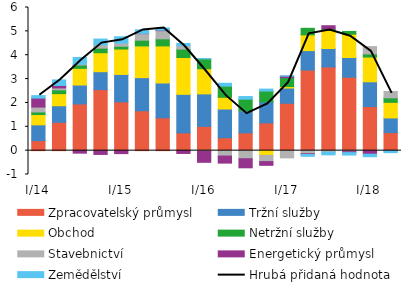
| Category | Zpracovatelský průmysl | Tržní služby | Obchod | Netržní služby  | Stavebnictví | Energetický průmysl | Zemědělství |
|---|---|---|---|---|---|---|---|
| I/14 | 0.421 | 0.66 | 0.432 | 0.109 | 0.205 | 0.374 | 0.105 |
| II | 1.187 | 0.694 | 0.508 | 0.16 | 0.08 | 0.102 | 0.233 |
| III | 1.957 | 0.794 | 0.7 | 0.137 | 0.035 | -0.106 | 0.281 |
|  IV | 2.558 | 0.751 | 0.795 | 0.191 | 0.135 | -0.16 | 0.247 |
| I/15 | 2.046 | 1.149 | 1.064 | 0.117 | 0.13 | -0.125 | 0.268 |
| II | 1.67 | 1.39 | 1.329 | 0.241 | 0.274 | 0.01 | 0.149 |
| III | 1.377 | 1.459 | 1.554 | 0.297 | 0.343 | 0.019 | 0.094 |
| IV | 0.746 | 1.614 | 1.545 | 0.351 | 0.143 | -0.119 | 0.094 |
| I/16 | 1.017 | 1.362 | 1.053 | 0.411 | -0.028 | -0.461 | 0.015 |
| II | 0.541 | 1.205 | 0.489 | 0.469 | -0.227 | -0.296 | 0.12 |
| III | 0.745 | 0.932 | 0.002 | 0.476 | -0.339 | -0.38 | 0.112 |
| IV | 1.161 | 0.881 | -0.198 | 0.454 | -0.262 | -0.156 | 0.084 |
| I/17 | 1.985 | 0.64 | 0.062 | 0.376 | -0.303 | 0.058 | 0.015 |
| II | 3.377 | 0.817 | 0.659 | 0.276 | -0.131 | -0.031 | -0.075 |
| III | 3.506 | 0.775 | 0.757 | 0.059 | -0.064 | 0.138 | -0.112 |
| IV | 3.077 | 0.827 | 0.978 | 0.114 | -0.044 | -0.039 | -0.102 |
| I/18 | 1.848 | 1.038 | 1.036 | 0.132 | 0.306 | -0.149 | -0.105 |
| II | 0.757 | 0.615 | 0.653 | 0.19 | 0.265 | -0.006 | -0.079 |